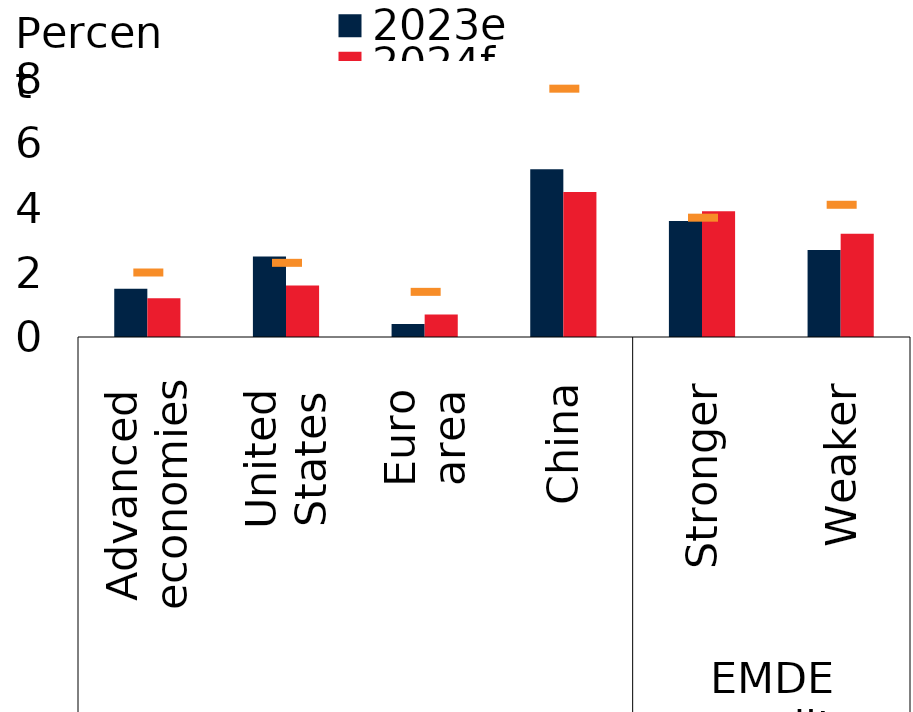
| Category | 2023e | 2024f |
|---|---|---|
| 0 | 1.5 | 1.2 |
| 1 | 2.5 | 1.6 |
| 2 | 0.4 | 0.7 |
| 3 | 5.2 | 4.5 |
| 4 | 3.6 | 3.9 |
| 5 | 2.7 | 3.2 |